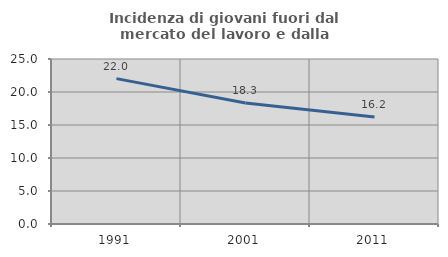
| Category | Incidenza di giovani fuori dal mercato del lavoro e dalla formazione  |
|---|---|
| 1991.0 | 22.025 |
| 2001.0 | 18.333 |
| 2011.0 | 16.207 |